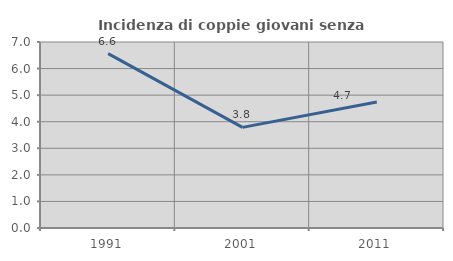
| Category | Incidenza di coppie giovani senza figli |
|---|---|
| 1991.0 | 6.562 |
| 2001.0 | 3.788 |
| 2011.0 | 4.74 |